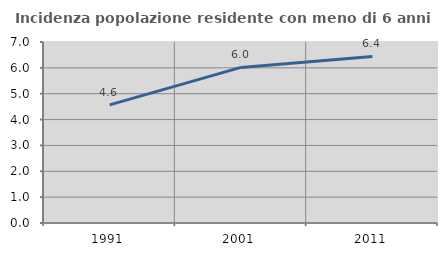
| Category | Incidenza popolazione residente con meno di 6 anni |
|---|---|
| 1991.0 | 4.568 |
| 2001.0 | 6.018 |
| 2011.0 | 6.439 |